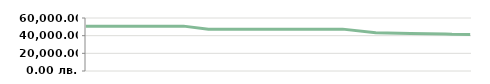
| Category | ТРИМЕСЕЧИЕ   |
|---|---|
| 2013-04-23 | 50800 |
| 2013-04-25 | 50800 |
| 2013-05-07 | 50800 |
| 2013-05-14 | 50800 |
| 2013-05-14 | 50800 |
| 2013-05-29 | 50800 |
| 2013-06-10 | 50800 |
| 2013-06-21 | 50800 |
| 2013-07-06 | 47400 |
| 2013-08-05 | 47400 |
| 2013-08-19 | 47400 |
| 2013-09-04 | 47400 |
| 2013-09-20 | 47400 |
| 2013-09-25 | 47400 |
| 2013-10-15 | 43258.14 |
| 2013-11-05 | 42312.903 |
| 2013-11-26 | 41811.111 |
| 2013-11-30 | 41500 |
| 2013-12-11 | 41288.235 |